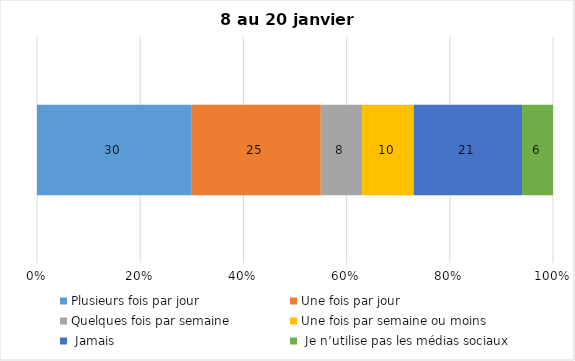
| Category | Plusieurs fois par jour | Une fois par jour | Quelques fois par semaine   | Une fois par semaine ou moins   |  Jamais   |  Je n’utilise pas les médias sociaux |
|---|---|---|---|---|---|---|
| 0 | 30 | 25 | 8 | 10 | 21 | 6 |